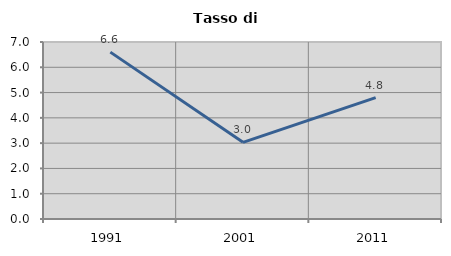
| Category | Tasso di disoccupazione   |
|---|---|
| 1991.0 | 6.599 |
| 2001.0 | 3.033 |
| 2011.0 | 4.803 |